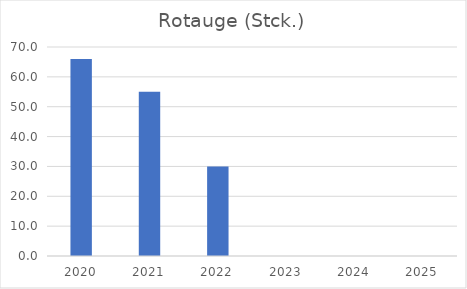
| Category | Rotauge (Stck.) |
|---|---|
| 2020.0 | 66 |
| 2021.0 | 55 |
| 2022.0 | 30 |
| 2023.0 | 0 |
| 2024.0 | 0 |
| 2025.0 | 0 |